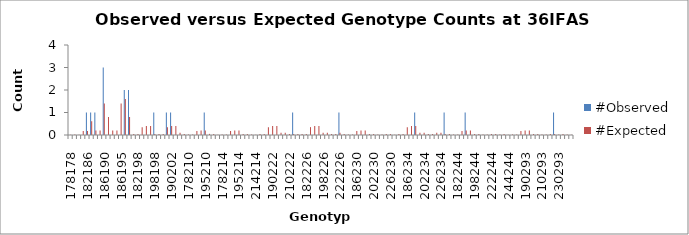
| Category | #Observed | #Expected |
|---|---|---|
| 178178.0 | 0 | 0.012 |
| 178182.0 | 0 | 0.025 |
| 182182.0 | 0 | 0.012 |
| 178186.0 | 0 | 0.175 |
| 182186.0 | 1 | 0.175 |
| 186186.0 | 1 | 0.612 |
| 178190.0 | 1 | 0.2 |
| 182190.0 | 0 | 0.2 |
| 186190.0 | 3 | 1.4 |
| 190190.0 | 0 | 0.8 |
| 178195.0 | 0 | 0.2 |
| 182195.0 | 0 | 0.2 |
| 186195.0 | 0 | 1.4 |
| 190195.0 | 2 | 1.6 |
| 195195.0 | 2 | 0.8 |
| 178198.0 | 0 | 0.05 |
| 182198.0 | 0 | 0.05 |
| 186198.0 | 0 | 0.35 |
| 190198.0 | 0 | 0.4 |
| 195198.0 | 0 | 0.4 |
| 198198.0 | 1 | 0.05 |
| 178202.0 | 0 | 0.05 |
| 182202.0 | 0 | 0.05 |
| 186202.0 | 1 | 0.35 |
| 190202.0 | 1 | 0.4 |
| 195202.0 | 0 | 0.4 |
| 198202.0 | 0 | 0.1 |
| 202202.0 | 0 | 0.05 |
| 178210.0 | 0 | 0.025 |
| 182210.0 | 0 | 0.025 |
| 186210.0 | 0 | 0.175 |
| 190210.0 | 0 | 0.2 |
| 195210.0 | 1 | 0.2 |
| 198210.0 | 0 | 0.05 |
| 202210.0 | 0 | 0.05 |
| 210210.0 | 0 | 0.012 |
| 178214.0 | 0 | 0.025 |
| 182214.0 | 0 | 0.025 |
| 186214.0 | 0 | 0.175 |
| 190214.0 | 0 | 0.2 |
| 195214.0 | 0 | 0.2 |
| 198214.0 | 0 | 0.05 |
| 202214.0 | 0 | 0.05 |
| 210214.0 | 0 | 0.025 |
| 214214.0 | 0 | 0.012 |
| 178222.0 | 0 | 0.05 |
| 182222.0 | 0 | 0.05 |
| 186222.0 | 0 | 0.35 |
| 190222.0 | 0 | 0.4 |
| 195222.0 | 0 | 0.4 |
| 198222.0 | 0 | 0.1 |
| 202222.0 | 0 | 0.1 |
| 210222.0 | 0 | 0.05 |
| 214222.0 | 1 | 0.05 |
| 222222.0 | 0 | 0.05 |
| 178226.0 | 0 | 0.05 |
| 182226.0 | 0 | 0.05 |
| 186226.0 | 0 | 0.35 |
| 190226.0 | 0 | 0.4 |
| 195226.0 | 0 | 0.4 |
| 198226.0 | 0 | 0.1 |
| 202226.0 | 0 | 0.1 |
| 210226.0 | 0 | 0.05 |
| 214226.0 | 0 | 0.05 |
| 222226.0 | 1 | 0.1 |
| 226226.0 | 0 | 0.05 |
| 178230.0 | 0 | 0.025 |
| 182230.0 | 0 | 0.025 |
| 186230.0 | 0 | 0.175 |
| 190230.0 | 0 | 0.2 |
| 195230.0 | 0 | 0.2 |
| 198230.0 | 0 | 0.05 |
| 202230.0 | 0 | 0.05 |
| 210230.0 | 0 | 0.025 |
| 214230.0 | 0 | 0.025 |
| 222230.0 | 0 | 0.05 |
| 226230.0 | 0 | 0.05 |
| 230230.0 | 0 | 0.012 |
| 178234.0 | 0 | 0.05 |
| 182234.0 | 0 | 0.05 |
| 186234.0 | 0 | 0.35 |
| 190234.0 | 0 | 0.4 |
| 195234.0 | 1 | 0.4 |
| 198234.0 | 0 | 0.1 |
| 202234.0 | 0 | 0.1 |
| 210234.0 | 0 | 0.05 |
| 214234.0 | 0 | 0.05 |
| 222234.0 | 0 | 0.1 |
| 226234.0 | 0 | 0.1 |
| 230234.0 | 1 | 0.05 |
| 234234.0 | 0 | 0.05 |
| 178244.0 | 0 | 0.025 |
| 182244.0 | 0 | 0.025 |
| 186244.0 | 0 | 0.175 |
| 190244.0 | 1 | 0.2 |
| 195244.0 | 0 | 0.2 |
| 198244.0 | 0 | 0.05 |
| 202244.0 | 0 | 0.05 |
| 210244.0 | 0 | 0.025 |
| 214244.0 | 0 | 0.025 |
| 222244.0 | 0 | 0.05 |
| 226244.0 | 0 | 0.05 |
| 230244.0 | 0 | 0.025 |
| 234244.0 | 0 | 0.05 |
| 244244.0 | 0 | 0.012 |
| 178293.0 | 0 | 0.025 |
| 182293.0 | 0 | 0.025 |
| 186293.0 | 0 | 0.175 |
| 190293.0 | 0 | 0.2 |
| 195293.0 | 0 | 0.2 |
| 198293.0 | 0 | 0.05 |
| 202293.0 | 0 | 0.05 |
| 210293.0 | 0 | 0.025 |
| 214293.0 | 0 | 0.025 |
| 222293.0 | 0 | 0.05 |
| 226293.0 | 1 | 0.05 |
| 230293.0 | 0 | 0.025 |
| 234293.0 | 0 | 0.05 |
| 244293.0 | 0 | 0.025 |
| 293293.0 | 0 | 0.012 |